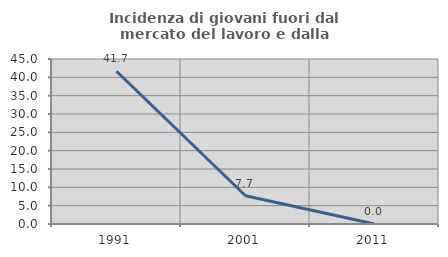
| Category | Incidenza di giovani fuori dal mercato del lavoro e dalla formazione  |
|---|---|
| 1991.0 | 41.667 |
| 2001.0 | 7.692 |
| 2011.0 | 0 |